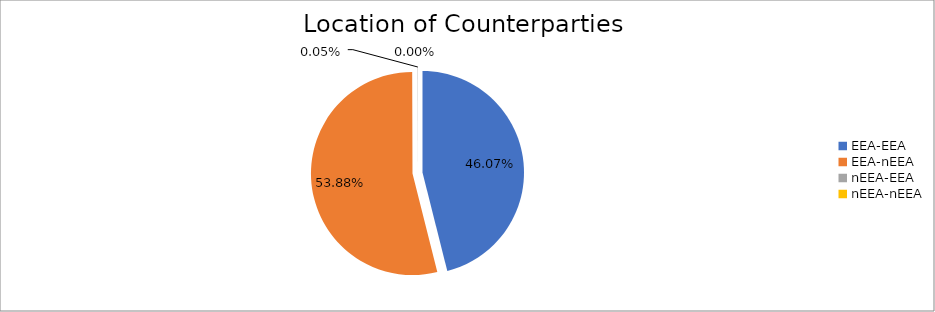
| Category | Series 0 |
|---|---|
| EEA-EEA | 3301276.174 |
| EEA-nEEA | 3860988.675 |
| nEEA-EEA | 3499.617 |
| nEEA-nEEA | 91.133 |